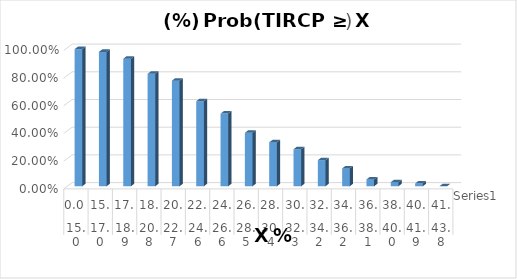
| Category | Series 0 |
|---|---|
| 0 | 0.99 |
| 1 | 0.97 |
| 2 | 0.921 |
| 3 | 0.812 |
| 4 | 0.762 |
| 5 | 0.614 |
| 6 | 0.525 |
| 7 | 0.386 |
| 8 | 0.317 |
| 9 | 0.267 |
| 10 | 0.188 |
| 11 | 0.129 |
| 12 | 0.05 |
| 13 | 0.03 |
| 14 | 0.02 |
| 15 | 0 |